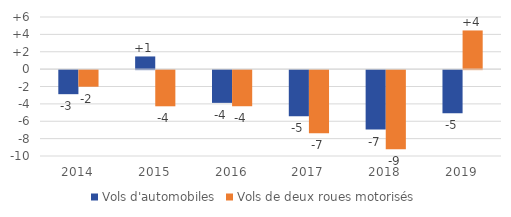
| Category | Vols d'automobiles | Vols de deux roues motorisés |
|---|---|---|
| 2014.0 | -2.769 | -1.91 |
| 2015.0 | 1.459 | -4.163 |
| 2016.0 | -3.77 | -4.157 |
| 2017.0 | -5.32 | -7.254 |
| 2018.0 | -6.836 | -9.121 |
| 2019.0 | -4.964 | 4.451 |